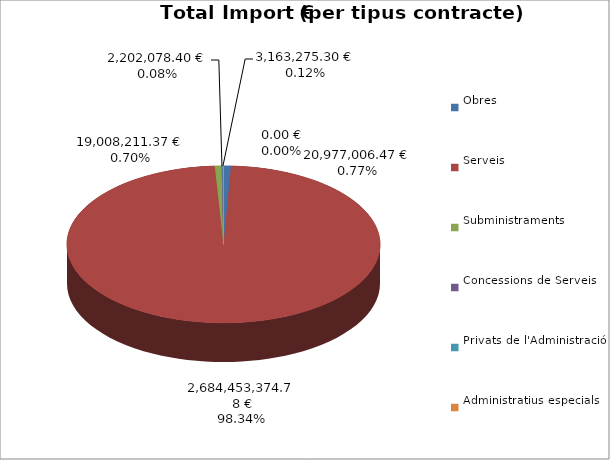
| Category | Total preu
(amb IVA) |
|---|---|
| Obres | 20977006.47 |
| Serveis | 2684453374.78 |
| Subministraments | 19008211.37 |
| Concessions de Serveis | 2202078.4 |
| Privats de l'Administració | 3163275.3 |
| Administratius especials | 0 |